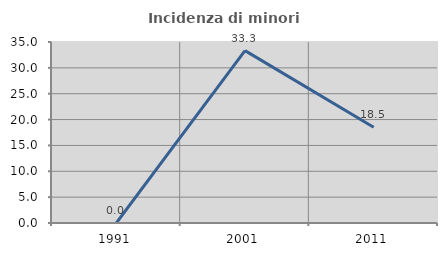
| Category | Incidenza di minori stranieri |
|---|---|
| 1991.0 | 0 |
| 2001.0 | 33.333 |
| 2011.0 | 18.519 |